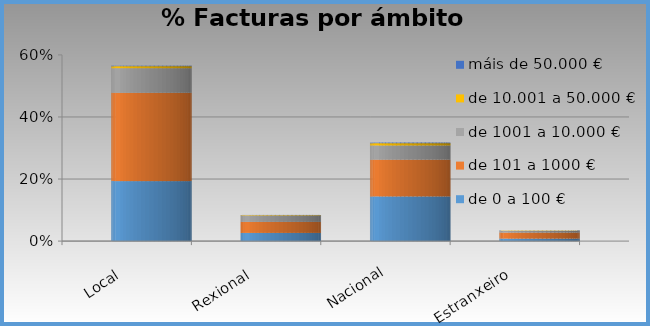
| Category | de 0 a 100 € | de 101 a 1000 € | de 1001 a 10.000 € | de 10.001 a 50.000 € | máis de 50.000 € |
|---|---|---|---|---|---|
| Local | 0.193 | 0.285 | 0.079 | 0.006 | 0.001 |
| Rexional | 0.026 | 0.035 | 0.021 | 0.001 | 0 |
| Nacional | 0.144 | 0.118 | 0.046 | 0.007 | 0.002 |
| Estranxeiro | 0.008 | 0.019 | 0.006 | 0.001 | 0 |